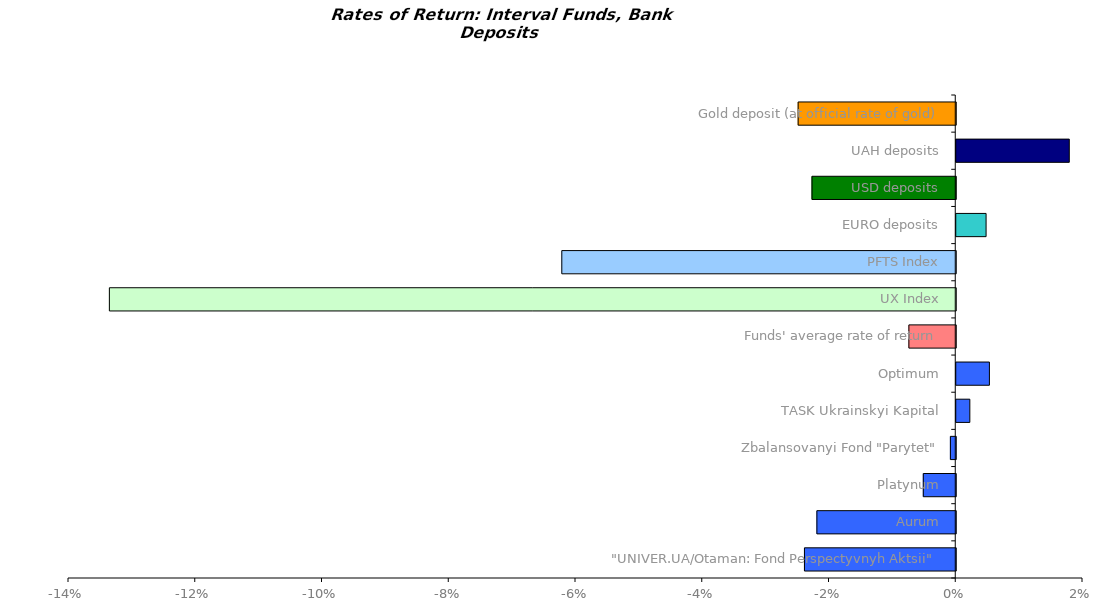
| Category | Series 0 |
|---|---|
| "UNIVER.UA/Otaman: Fond Perspectyvnyh Aktsii" | -0.024 |
| Aurum | -0.022 |
| Platynum | -0.005 |
| Zbalansovanyi Fond "Parytet" | -0.001 |
| TASK Ukrainskyi Kapital | 0.002 |
| Optimum | 0.005 |
| Funds' average rate of return | -0.007 |
| UX Index | -0.134 |
| PFTS Index | -0.062 |
| EURO deposits | 0.005 |
| USD deposits | -0.023 |
| UAH deposits | 0.018 |
| Gold deposit (at official rate of gold) | -0.025 |